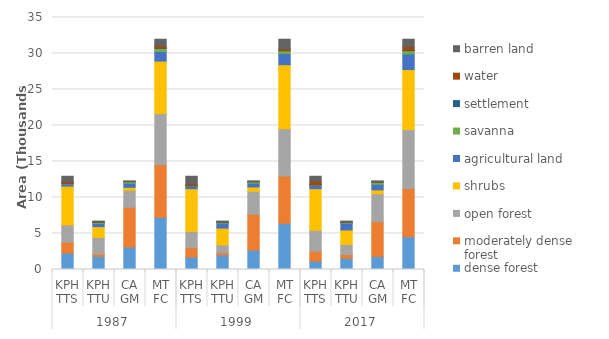
| Category | dense forest | moderately dense forest | open forest | shrubs | agricultural land | savanna | settlement | water | barren land |
|---|---|---|---|---|---|---|---|---|---|
| 0 | 2286.18 | 1493.64 | 2427.57 | 5371.2 | 312.75 | 78.66 | 6.12 | 238.77 | 734.31 |
| 1 | 1841.49 | 312.03 | 2302.38 | 1497.69 | 450.81 | 141.93 | 27.54 | 42.57 | 106.92 |
| 2 | 3118.59 | 5506.11 | 2378.34 | 412.11 | 564.3 | 221.85 | 8.55 | 3.42 | 97.92 |
| 3 | 7246.26 | 7311.78 | 7108.29 | 7281 | 1327.86 | 442.44 | 42.21 | 284.76 | 939.15 |
| 4 | 1727.37 | 1293.84 | 2261.61 | 5943.42 | 348.3 | 55.17 | 12.42 | 234.72 | 1072.35 |
| 5 | 1998.45 | 291.42 | 1113.57 | 2348.37 | 686.88 | 116.19 | 20.52 | 13.5 | 134.46 |
| 6 | 2687.13 | 4995.9 | 3180.51 | 599.76 | 511.2 | 216.18 | 9.99 | 0.81 | 109.71 |
| 7 | 6412.95 | 6581.16 | 6555.69 | 8891.55 | 1546.38 | 387.54 | 42.93 | 249.03 | 1316.52 |
| 8 | 1163.16 | 1377 | 2901.87 | 5786.91 | 473.85 | 59.22 | 17.37 | 481.41 | 688.41 |
| 9 | 1565.82 | 493.38 | 1419.93 | 2013.66 | 923.85 | 102.06 | 25.83 | 29.97 | 148.86 |
| 10 | 1813.5 | 4830.84 | 3869.28 | 544.86 | 770.4 | 282.96 | 7.02 | 4.14 | 188.19 |
| 11 | 4542.48 | 6701.22 | 8191.08 | 8345.43 | 2168.1 | 444.24 | 50.22 | 515.52 | 1025.46 |